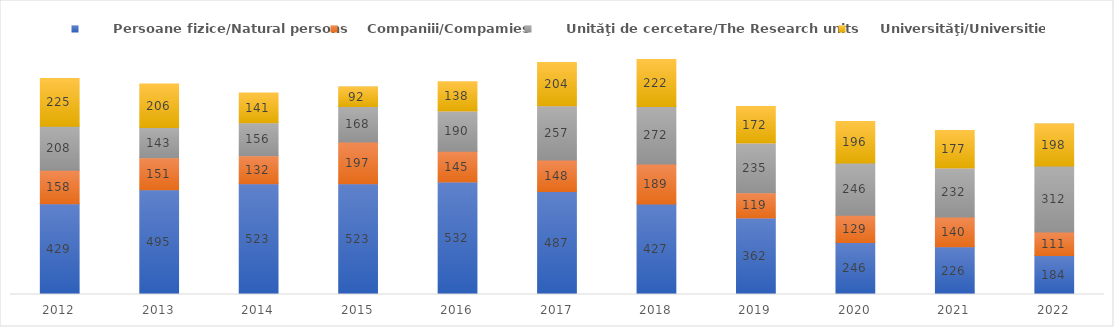
| Category |       Persoane fizice/Natural persons |      Companiii/Compamies |       Unităţi de cercetare/The Research units |       Universităţi/Universities |
|---|---|---|---|---|
| 2012.0 | 429 | 158 | 208 | 225 |
| 2013.0 | 495 | 151 | 143 | 206 |
| 2014.0 | 523 | 132 | 156 | 141 |
| 2015.0 | 523 | 197 | 168 | 92 |
| 2016.0 | 532 | 145 | 190 | 138 |
| 2017.0 | 487 | 148 | 257 | 204 |
| 2018.0 | 427 | 189 | 272 | 222 |
| 2019.0 | 362 | 119 | 235 | 172 |
| 2020.0 | 246 | 129 | 246 | 196 |
| 2021.0 | 226 | 140 | 232 | 177 |
| 2022.0 | 184 | 111 | 312 | 198 |